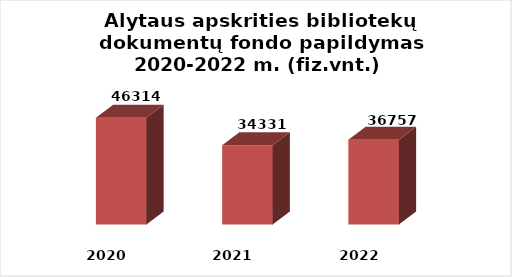
| Category | Series 0 |
|---|---|
| 2020.0 | 46314 |
| 2021.0 | 34331 |
| 2022.0 | 36757 |